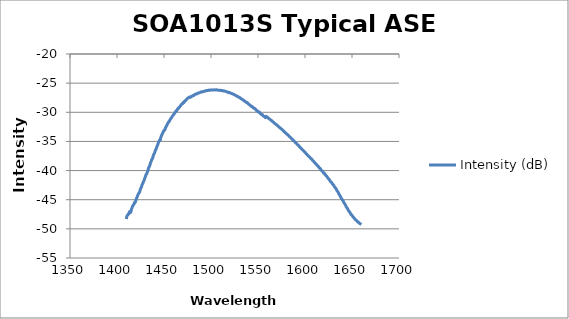
| Category | Intensity (dB) |
|---|---|
| 1410.0 | -48.322 |
| 1410.5 | -47.827 |
| 1411.0 | -47.689 |
| 1411.5 | -47.601 |
| 1412.0 | -47.454 |
| 1412.5 | -47.461 |
| 1413.0 | -47.197 |
| 1413.5 | -47.036 |
| 1414.0 | -47.029 |
| 1414.5 | -47.205 |
| 1415.0 | -46.903 |
| 1415.5 | -46.581 |
| 1416.0 | -46.373 |
| 1416.5 | -46.13 |
| 1417.0 | -46.017 |
| 1417.5 | -45.861 |
| 1418.0 | -45.787 |
| 1418.5 | -45.499 |
| 1419.0 | -45.497 |
| 1419.5 | -45.402 |
| 1420.0 | -45.122 |
| 1420.5 | -44.886 |
| 1421.0 | -44.701 |
| 1421.5 | -44.494 |
| 1422.0 | -44.286 |
| 1422.5 | -44.055 |
| 1423.0 | -43.94 |
| 1423.5 | -43.809 |
| 1424.0 | -43.706 |
| 1424.5 | -43.425 |
| 1425.0 | -43.122 |
| 1425.5 | -42.996 |
| 1426.0 | -42.814 |
| 1426.5 | -42.538 |
| 1427.0 | -42.329 |
| 1427.5 | -42.178 |
| 1428.0 | -41.967 |
| 1428.5 | -41.821 |
| 1429.0 | -41.588 |
| 1429.5 | -41.332 |
| 1430.0 | -41.125 |
| 1430.5 | -40.902 |
| 1431.0 | -40.649 |
| 1431.5 | -40.582 |
| 1432.0 | -40.353 |
| 1432.5 | -40.168 |
| 1433.0 | -39.933 |
| 1433.5 | -39.601 |
| 1434.0 | -39.418 |
| 1434.5 | -39.32 |
| 1435.0 | -39.037 |
| 1435.5 | -38.765 |
| 1436.0 | -38.535 |
| 1436.5 | -38.375 |
| 1437.0 | -38.095 |
| 1437.5 | -37.937 |
| 1438.0 | -37.878 |
| 1438.5 | -37.495 |
| 1439.0 | -37.254 |
| 1439.5 | -37.108 |
| 1440.0 | -36.971 |
| 1440.5 | -36.676 |
| 1441.0 | -36.464 |
| 1441.5 | -36.337 |
| 1442.0 | -36.113 |
| 1442.5 | -35.848 |
| 1443.0 | -35.712 |
| 1443.5 | -35.486 |
| 1444.0 | -35.24 |
| 1444.5 | -35.07 |
| 1445.0 | -34.868 |
| 1445.5 | -34.73 |
| 1446.0 | -34.814 |
| 1446.5 | -34.355 |
| 1447.0 | -34.132 |
| 1447.5 | -33.97 |
| 1448.0 | -33.768 |
| 1448.5 | -33.609 |
| 1449.0 | -33.435 |
| 1449.5 | -33.262 |
| 1450.0 | -33.125 |
| 1450.5 | -33.044 |
| 1451.0 | -32.995 |
| 1451.5 | -32.718 |
| 1452.0 | -32.499 |
| 1452.5 | -32.416 |
| 1453.0 | -32.218 |
| 1453.5 | -32.062 |
| 1454.0 | -31.912 |
| 1454.5 | -31.783 |
| 1455.0 | -31.641 |
| 1455.5 | -31.598 |
| 1456.0 | -31.41 |
| 1456.5 | -31.27 |
| 1457.0 | -31.133 |
| 1457.5 | -31.02 |
| 1458.0 | -30.925 |
| 1458.5 | -30.772 |
| 1459.0 | -30.657 |
| 1459.5 | -30.539 |
| 1460.0 | -30.431 |
| 1460.5 | -30.373 |
| 1461.0 | -30.209 |
| 1461.5 | -30.113 |
| 1462.0 | -29.979 |
| 1462.5 | -29.852 |
| 1463.0 | -29.752 |
| 1463.5 | -29.743 |
| 1464.0 | -29.552 |
| 1464.5 | -29.436 |
| 1465.0 | -29.341 |
| 1465.5 | -29.324 |
| 1466.0 | -29.158 |
| 1466.5 | -29.076 |
| 1467.0 | -28.991 |
| 1467.5 | -28.889 |
| 1468.0 | -28.787 |
| 1468.5 | -28.66 |
| 1469.0 | -28.566 |
| 1469.5 | -28.508 |
| 1470.0 | -28.49 |
| 1470.5 | -28.305 |
| 1471.0 | -28.358 |
| 1471.5 | -28.196 |
| 1472.0 | -28.07 |
| 1472.5 | -28.081 |
| 1473.0 | -27.962 |
| 1473.5 | -27.858 |
| 1474.0 | -27.802 |
| 1474.5 | -27.694 |
| 1475.0 | -27.625 |
| 1475.5 | -27.553 |
| 1476.0 | -27.521 |
| 1476.5 | -27.435 |
| 1477.0 | -27.392 |
| 1477.5 | -27.383 |
| 1478.0 | -27.447 |
| 1478.5 | -27.383 |
| 1479.0 | -27.29 |
| 1479.5 | -27.276 |
| 1480.0 | -27.197 |
| 1480.5 | -27.192 |
| 1481.0 | -27.174 |
| 1481.5 | -27.065 |
| 1482.0 | -27.083 |
| 1482.5 | -26.981 |
| 1483.0 | -26.94 |
| 1483.5 | -26.894 |
| 1484.0 | -26.874 |
| 1484.5 | -26.856 |
| 1485.0 | -26.843 |
| 1485.5 | -26.759 |
| 1486.0 | -26.703 |
| 1486.5 | -26.69 |
| 1487.0 | -26.705 |
| 1487.5 | -26.663 |
| 1488.0 | -26.624 |
| 1488.5 | -26.593 |
| 1489.0 | -26.54 |
| 1489.5 | -26.488 |
| 1490.0 | -26.518 |
| 1490.5 | -26.489 |
| 1491.0 | -26.485 |
| 1491.5 | -26.48 |
| 1492.0 | -26.433 |
| 1492.5 | -26.418 |
| 1493.0 | -26.401 |
| 1493.5 | -26.362 |
| 1494.0 | -26.297 |
| 1494.5 | -26.323 |
| 1495.0 | -26.283 |
| 1495.5 | -26.28 |
| 1496.0 | -26.26 |
| 1496.5 | -26.273 |
| 1497.0 | -26.229 |
| 1497.5 | -26.197 |
| 1498.0 | -26.202 |
| 1498.5 | -26.216 |
| 1499.0 | -26.203 |
| 1499.5 | -26.182 |
| 1500.0 | -26.153 |
| 1500.5 | -26.162 |
| 1501.0 | -26.179 |
| 1501.5 | -26.175 |
| 1502.0 | -26.187 |
| 1502.5 | -26.188 |
| 1503.0 | -26.161 |
| 1503.5 | -26.139 |
| 1504.0 | -26.149 |
| 1504.5 | -26.174 |
| 1505.0 | -26.167 |
| 1505.5 | -26.143 |
| 1506.0 | -26.142 |
| 1506.5 | -26.186 |
| 1507.0 | -26.195 |
| 1507.5 | -26.198 |
| 1508.0 | -26.205 |
| 1508.5 | -26.225 |
| 1509.0 | -26.221 |
| 1509.5 | -26.216 |
| 1510.0 | -26.255 |
| 1510.5 | -26.26 |
| 1511.0 | -26.239 |
| 1511.5 | -26.253 |
| 1512.0 | -26.251 |
| 1512.5 | -26.282 |
| 1513.0 | -26.33 |
| 1513.5 | -26.342 |
| 1514.0 | -26.326 |
| 1514.5 | -26.363 |
| 1515.0 | -26.383 |
| 1515.5 | -26.416 |
| 1516.0 | -26.451 |
| 1516.5 | -26.475 |
| 1517.0 | -26.489 |
| 1517.5 | -26.543 |
| 1518.0 | -26.57 |
| 1518.5 | -26.619 |
| 1519.0 | -26.627 |
| 1519.5 | -26.61 |
| 1520.0 | -26.636 |
| 1520.5 | -26.675 |
| 1521.0 | -26.746 |
| 1521.5 | -26.747 |
| 1522.0 | -26.775 |
| 1522.5 | -26.806 |
| 1523.0 | -26.844 |
| 1523.5 | -26.889 |
| 1524.0 | -26.93 |
| 1524.5 | -26.95 |
| 1525.0 | -27.003 |
| 1525.5 | -27.039 |
| 1526.0 | -27.072 |
| 1526.5 | -27.15 |
| 1527.0 | -27.174 |
| 1527.5 | -27.214 |
| 1528.0 | -27.234 |
| 1528.5 | -27.342 |
| 1529.0 | -27.368 |
| 1529.5 | -27.393 |
| 1530.0 | -27.418 |
| 1530.5 | -27.473 |
| 1531.0 | -27.542 |
| 1531.5 | -27.599 |
| 1532.0 | -27.676 |
| 1532.5 | -27.723 |
| 1533.0 | -27.778 |
| 1533.5 | -27.82 |
| 1534.0 | -27.849 |
| 1534.5 | -27.938 |
| 1535.0 | -28.022 |
| 1535.5 | -28.073 |
| 1536.0 | -28.103 |
| 1536.5 | -28.159 |
| 1537.0 | -28.247 |
| 1537.5 | -28.281 |
| 1538.0 | -28.336 |
| 1538.5 | -28.336 |
| 1539.0 | -28.41 |
| 1539.5 | -28.519 |
| 1540.0 | -28.609 |
| 1540.5 | -28.662 |
| 1541.0 | -28.705 |
| 1541.5 | -28.772 |
| 1542.0 | -28.85 |
| 1542.5 | -28.952 |
| 1543.0 | -28.964 |
| 1543.5 | -29.007 |
| 1544.0 | -29.096 |
| 1544.5 | -29.112 |
| 1545.0 | -29.218 |
| 1545.5 | -29.313 |
| 1546.0 | -29.32 |
| 1546.5 | -29.353 |
| 1547.0 | -29.384 |
| 1547.5 | -29.514 |
| 1548.0 | -29.612 |
| 1548.5 | -29.728 |
| 1549.0 | -29.698 |
| 1549.5 | -29.765 |
| 1550.0 | -29.897 |
| 1550.5 | -29.94 |
| 1551.0 | -30.019 |
| 1551.5 | -29.962 |
| 1552.0 | -30.091 |
| 1552.5 | -30.224 |
| 1553.0 | -30.296 |
| 1553.5 | -30.369 |
| 1554.0 | -30.388 |
| 1554.5 | -30.379 |
| 1555.0 | -30.494 |
| 1555.5 | -30.609 |
| 1556.0 | -30.669 |
| 1556.5 | -30.709 |
| 1557.0 | -30.778 |
| 1557.5 | -30.873 |
| 1558.0 | -30.911 |
| 1558.5 | -30.701 |
| 1559.0 | -30.747 |
| 1559.5 | -30.784 |
| 1560.0 | -30.835 |
| 1560.5 | -30.91 |
| 1561.0 | -30.996 |
| 1561.5 | -31.062 |
| 1562.0 | -31.111 |
| 1562.5 | -31.174 |
| 1563.0 | -31.258 |
| 1563.5 | -31.325 |
| 1564.0 | -31.368 |
| 1564.5 | -31.428 |
| 1565.0 | -31.51 |
| 1565.5 | -31.59 |
| 1566.0 | -31.645 |
| 1566.5 | -31.701 |
| 1567.0 | -31.775 |
| 1567.5 | -31.869 |
| 1568.0 | -31.935 |
| 1568.5 | -31.98 |
| 1569.0 | -32.045 |
| 1569.5 | -32.13 |
| 1570.0 | -32.198 |
| 1570.5 | -32.248 |
| 1571.0 | -32.309 |
| 1571.5 | -32.394 |
| 1572.0 | -32.487 |
| 1572.5 | -32.557 |
| 1573.0 | -32.608 |
| 1573.5 | -32.677 |
| 1574.0 | -32.756 |
| 1574.5 | -32.828 |
| 1575.0 | -32.867 |
| 1575.5 | -32.931 |
| 1576.0 | -33.026 |
| 1576.5 | -33.123 |
| 1577.0 | -33.183 |
| 1577.5 | -33.24 |
| 1578.0 | -33.326 |
| 1578.5 | -33.421 |
| 1579.0 | -33.49 |
| 1579.5 | -33.544 |
| 1580.0 | -33.611 |
| 1580.5 | -33.702 |
| 1581.0 | -33.788 |
| 1581.5 | -33.843 |
| 1582.0 | -33.903 |
| 1582.5 | -34 |
| 1583.0 | -34.106 |
| 1583.5 | -34.192 |
| 1584.0 | -34.244 |
| 1584.5 | -34.308 |
| 1585.0 | -34.407 |
| 1585.5 | -34.496 |
| 1586.0 | -34.552 |
| 1586.5 | -34.612 |
| 1587.0 | -34.71 |
| 1587.5 | -34.828 |
| 1588.0 | -34.906 |
| 1588.5 | -34.958 |
| 1589.0 | -35.038 |
| 1589.5 | -35.148 |
| 1590.0 | -35.242 |
| 1590.5 | -35.304 |
| 1591.0 | -35.37 |
| 1591.5 | -35.452 |
| 1592.0 | -35.555 |
| 1592.5 | -35.622 |
| 1593.0 | -35.675 |
| 1593.5 | -35.759 |
| 1594.0 | -35.878 |
| 1594.5 | -35.984 |
| 1595.0 | -36.048 |
| 1595.5 | -36.118 |
| 1596.0 | -36.218 |
| 1596.5 | -36.32 |
| 1597.0 | -36.394 |
| 1597.5 | -36.453 |
| 1598.0 | -36.52 |
| 1598.5 | -36.626 |
| 1599.0 | -36.718 |
| 1599.5 | -36.781 |
| 1600.0 | -36.844 |
| 1600.5 | -36.949 |
| 1601.0 | -37.073 |
| 1601.5 | -37.162 |
| 1602.0 | -37.22 |
| 1602.5 | -37.291 |
| 1603.0 | -37.393 |
| 1603.5 | -37.507 |
| 1604.0 | -37.566 |
| 1604.5 | -37.619 |
| 1605.0 | -37.69 |
| 1605.5 | -37.807 |
| 1606.0 | -37.892 |
| 1606.5 | -37.944 |
| 1607.0 | -38.005 |
| 1607.5 | -38.13 |
| 1608.0 | -38.254 |
| 1608.5 | -38.331 |
| 1609.0 | -38.391 |
| 1609.5 | -38.487 |
| 1610.0 | -38.585 |
| 1610.5 | -38.693 |
| 1611.0 | -38.76 |
| 1611.5 | -38.828 |
| 1612.0 | -38.913 |
| 1612.5 | -39.031 |
| 1613.0 | -39.121 |
| 1613.5 | -39.177 |
| 1614.0 | -39.264 |
| 1614.5 | -39.37 |
| 1615.0 | -39.481 |
| 1615.5 | -39.569 |
| 1616.0 | -39.62 |
| 1616.5 | -39.724 |
| 1617.0 | -39.845 |
| 1617.5 | -39.97 |
| 1618.0 | -40.045 |
| 1618.5 | -40.1 |
| 1619.0 | -40.198 |
| 1619.5 | -40.331 |
| 1620.0 | -40.477 |
| 1620.5 | -40.45 |
| 1621.0 | -40.559 |
| 1621.5 | -40.681 |
| 1622.0 | -40.808 |
| 1622.5 | -40.897 |
| 1623.0 | -40.955 |
| 1623.5 | -41.05 |
| 1624.0 | -41.183 |
| 1624.5 | -41.307 |
| 1625.0 | -41.398 |
| 1625.5 | -41.46 |
| 1626.0 | -41.568 |
| 1626.5 | -41.72 |
| 1627.0 | -41.847 |
| 1627.5 | -41.926 |
| 1628.0 | -41.99 |
| 1628.5 | -42.105 |
| 1629.0 | -42.247 |
| 1629.5 | -42.358 |
| 1630.0 | -42.44 |
| 1630.5 | -42.526 |
| 1631.0 | -42.655 |
| 1631.5 | -42.814 |
| 1632.0 | -42.923 |
| 1632.5 | -43.01 |
| 1633.0 | -43.114 |
| 1633.5 | -43.291 |
| 1634.0 | -43.443 |
| 1634.5 | -43.548 |
| 1635.0 | -43.653 |
| 1635.5 | -43.806 |
| 1636.0 | -43.994 |
| 1636.5 | -44.156 |
| 1637.0 | -44.263 |
| 1637.5 | -44.373 |
| 1638.0 | -44.542 |
| 1638.5 | -44.729 |
| 1639.0 | -44.864 |
| 1639.5 | -44.976 |
| 1640.0 | -45.03 |
| 1640.5 | -45.164 |
| 1641.0 | -45.367 |
| 1641.5 | -45.537 |
| 1642.0 | -45.64 |
| 1642.5 | -45.751 |
| 1643.0 | -45.924 |
| 1643.5 | -46.084 |
| 1644.0 | -46.246 |
| 1644.5 | -46.334 |
| 1645.0 | -46.445 |
| 1645.5 | -46.619 |
| 1646.0 | -46.805 |
| 1646.5 | -46.915 |
| 1647.0 | -46.995 |
| 1647.5 | -47.092 |
| 1648.0 | -47.268 |
| 1648.5 | -47.415 |
| 1649.0 | -47.533 |
| 1649.5 | -47.577 |
| 1650.0 | -47.683 |
| 1650.5 | -47.805 |
| 1651.0 | -47.932 |
| 1651.5 | -48.004 |
| 1652.0 | -48.115 |
| 1652.5 | -48.177 |
| 1653.0 | -48.323 |
| 1653.5 | -48.423 |
| 1654.0 | -48.474 |
| 1654.5 | -48.509 |
| 1655.0 | -48.585 |
| 1655.5 | -48.708 |
| 1656.0 | -48.804 |
| 1656.5 | -48.824 |
| 1657.0 | -48.86 |
| 1657.5 | -48.949 |
| 1658.0 | -49.062 |
| 1658.5 | -49.111 |
| 1659.0 | -49.14 |
| 1659.5 | -49.197 |
| 1660.0 | -49.248 |